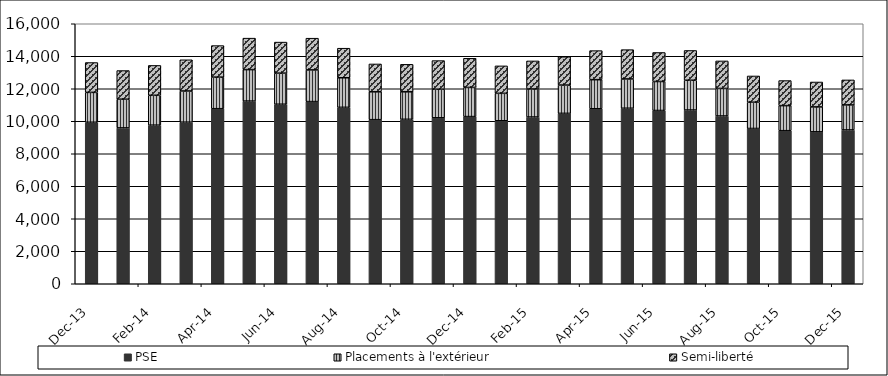
| Category | PSE | Placements à l'extérieur | Semi-liberté |
|---|---|---|---|
| 2013-12-01 | 9938 | 1838 | 1838 |
| 2014-01-01 | 9591 | 1765 | 1765 |
| 2014-02-01 | 9760 | 1838 | 1838 |
| 2014-03-01 | 9943 | 1920 | 1920 |
| 2014-04-01 | 10773 | 1942 | 1942 |
| 2014-05-01 | 11241 | 1937 | 1937 |
| 2014-06-01 | 11048 | 1912 | 1912 |
| 2014-07-01 | 11210 | 1951 | 1951 |
| 2014-08-01 | 10856 | 1820 | 1820 |
| 2014-09-01 | 10098 | 1714 | 1714 |
| 2014-10-01 | 10120 | 1692 | 1692 |
| 2014-11-01 | 10213 | 1760 | 1760 |
| 2014-12-01 | 10287 | 1794 | 1794 |
| 2015-01-01 | 10030 | 1689 | 1689 |
| 2015-02-01 | 10261 | 1726 | 1726 |
| 2015-03-01 | 10485 | 1742 | 1742 |
| 2015-04-01 | 10770 | 1789 | 1789 |
| 2015-05-01 | 10801 | 1803 | 1803 |
| 2015-06-01 | 10662 | 1785 | 1785 |
| 2015-07-01 | 10692 | 1832 | 1832 |
| 2015-08-01 | 10325 | 1694 | 1694 |
| 2015-09-01 | 9555 | 1616 | 1616 |
| 2015-10-01 | 9420 | 1542 | 1542 |
| 2015-11-01 | 9350 | 1533 | 1533 |
| 2015-12-01 | 9466 | 1539 | 1539 |